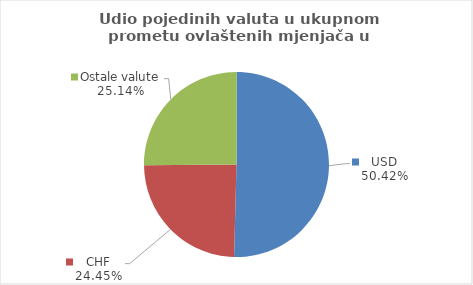
| Category | Series 0 |
|---|---|
| USD | 50.419 |
| CHF | 24.448 |
| Ostale valute | 25.133 |